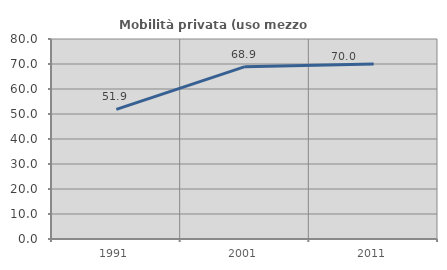
| Category | Mobilità privata (uso mezzo privato) |
|---|---|
| 1991.0 | 51.852 |
| 2001.0 | 68.949 |
| 2011.0 | 70.022 |